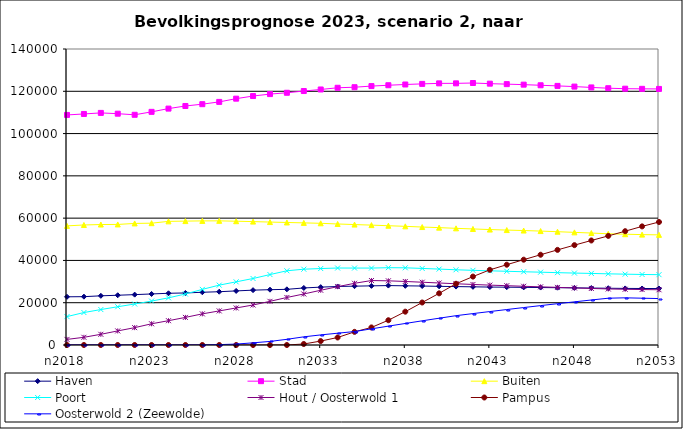
| Category | Haven | Stad | Buiten | Poort | Hout / Oosterwold 1 | Pampus | Oosterwold 2 (Zeewolde) |
|---|---|---|---|---|---|---|---|
| n2018 | 22795 | 108811 | 56339 | 13431 | 2652 | 0 | 0 |
| n2019 | 22863 | 109274 | 56769 | 15350 | 3639 | 0 | 0 |
| n2020 | 23263 | 109776 | 56980 | 16767 | 5055 | 0 | 0 |
| n2021 | 23531 | 109402 | 57019 | 18097 | 6659 | 0 | 0 |
| n2022 | 23825 | 108881 | 57500 | 19386 | 8207 | 0 | 0 |
| n2023 | 24139 | 110270 | 57621 | 20778 | 10033 | 0 | 0 |
| n2024 | 24467 | 111808 | 58472 | 22310 | 11499 | 0 | 0 |
| n2025 | 24613 | 113043 | 58603 | 24116 | 13055 | 0 | 0 |
| n2026 | 24944 | 113902 | 58695 | 26304 | 14722 | 0 | 0 |
| n2027 | 25196 | 114981 | 58719 | 28318 | 16122 | 0 | 178 |
| n2028 | 25582 | 116513 | 58551 | 29876 | 17518 | 0 | 430 |
| n2029 | 25943 | 117750 | 58366 | 31446 | 18923 | 0 | 1021 |
| n2030 | 26162 | 118678 | 58139 | 33313 | 20654 | 0 | 1689 |
| n2031 | 26330 | 119295 | 57952 | 35101 | 22479 | 0 | 2687 |
| n2032 | 26976 | 120118 | 57760 | 35856 | 24136 | 475 | 3861 |
| n2033 | 27369 | 120856 | 57559 | 36166 | 25893 | 1857 | 4773 |
| n2034 | 27678 | 121664 | 57243 | 36409 | 27585 | 3553 | 5577 |
| n2035 | 27830 | 121927 | 56961 | 36393 | 29189 | 6218 | 6363 |
| n2036 | 27972 | 122462 | 56702 | 36386 | 30489 | 8306 | 7639 |
| n2037 | 28109 | 122860 | 56412 | 36562 | 30354 | 11716 | 8920 |
| n2038 | 27990 | 123213 | 56125 | 36513 | 30045 | 15761 | 10181 |
| n2039 | 27893 | 123502 | 55793 | 36215 | 29690 | 20104 | 11436 |
| n2040 | 27743 | 123743 | 55513 | 35902 | 29330 | 24436 | 12667 |
| n2041 | 27629 | 123756 | 55181 | 35576 | 28965 | 28961 | 13871 |
| n2042 | 27515 | 123914 | 54894 | 35316 | 28637 | 32359 | 14859 |
| n2043 | 27400 | 123603 | 54595 | 35090 | 28313 | 35550 | 15817 |
| n2044 | 27347 | 123386 | 54359 | 34861 | 28049 | 37974 | 16775 |
| n2045 | 27265 | 123139 | 54136 | 34643 | 27776 | 40354 | 17710 |
| n2046 | 27173 | 122842 | 53887 | 34439 | 27510 | 42691 | 18635 |
| n2047 | 27098 | 122548 | 53579 | 34216 | 27258 | 44990 | 19534 |
| n2048 | 27039 | 122220 | 53270 | 34024 | 26983 | 47229 | 20407 |
| n2049 | 26936 | 121821 | 52954 | 33851 | 26752 | 49435 | 21284 |
| n2050 | 26846 | 121454 | 52607 | 33661 | 26504 | 51597 | 22131 |
| n2051 | 26763 | 121222 | 52401 | 33503 | 26355 | 53824 | 22318 |
| n2052 | 26730 | 121161 | 52210 | 33358 | 26230 | 56106 | 22136 |
| n2053 | 26701 | 121117 | 52091 | 33267 | 26131 | 58174 | 21958 |